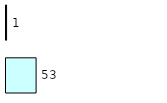
| Category | Series 0 | Series 1 |
|---|---|---|
| 0 | 53 | 1 |